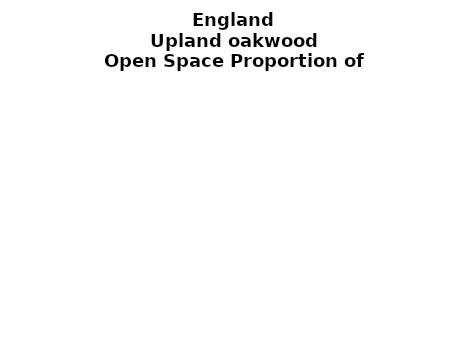
| Category | 43% |
|---|---|
|  ≥ 10ha, < 10%  | 0.367 |
|   ≥ 10ha, 10-25% | 0.164 |
|   ≥ 10ha, > 25 and <50%  | 0.116 |
|   ≥ 10ha, ≥ 50%  | 0.142 |
|  < 10ha, < 10% | 0.017 |
|  < 10ha, 10-25% | 0.028 |
|  < 10ha, > 25 and < 50% | 0.06 |
|  < 10ha, ≥ 50% | 0.105 |